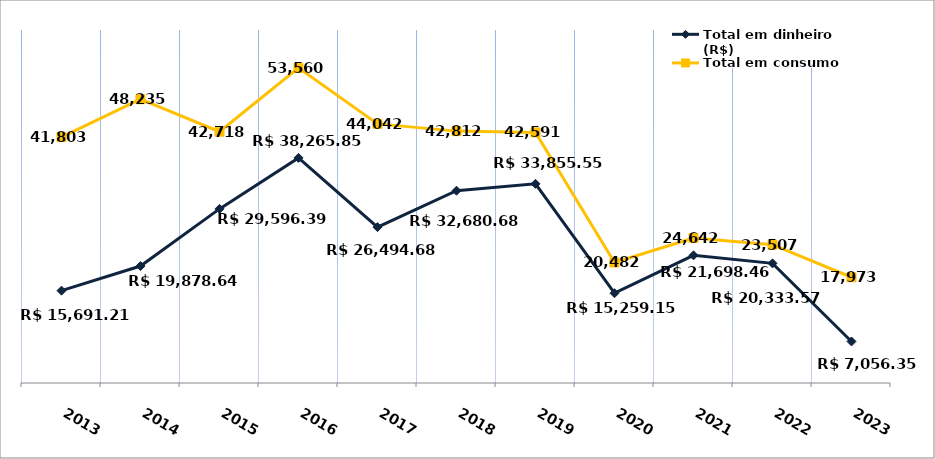
| Category | Total em dinheiro (R$) |
|---|---|
| 2013.0 | 15691.21 |
| 2014.0 | 19878.64 |
| 2015.0 | 29596.39 |
| 2016.0 | 38265.85 |
| 2017.0 | 26494.68 |
| 2018.0 | 32680.68 |
| 2019.0 | 33855.55 |
| 2020.0 | 15259.15 |
| 2021.0 | 21698.46 |
| 2022.0 | 20333.57 |
| 2023.0 | 7056.35 |